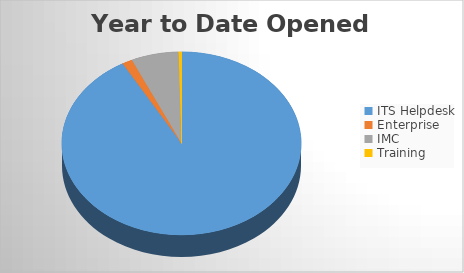
| Category | YTD Opened Tickets | 6M Opened |
|---|---|---|
| ITS Helpdesk | 2580 | 2580 |
| Enterprise | 39 | 39 |
| IMC | 180 | 180 |
| Training | 11 | 11 |